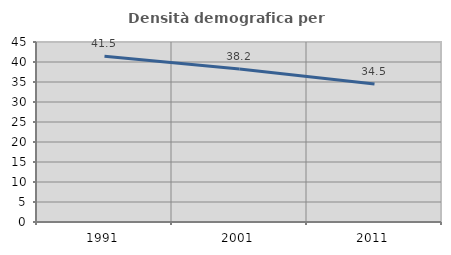
| Category | Densità demografica |
|---|---|
| 1991.0 | 41.461 |
| 2001.0 | 38.224 |
| 2011.0 | 34.492 |